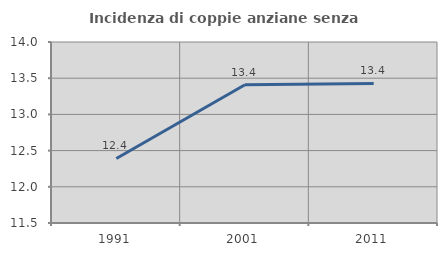
| Category | Incidenza di coppie anziane senza figli  |
|---|---|
| 1991.0 | 12.392 |
| 2001.0 | 13.41 |
| 2011.0 | 13.427 |